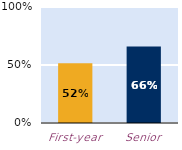
| Category | At least some |
|---|---|
| First-year | 0.515 |
| Senior | 0.66 |